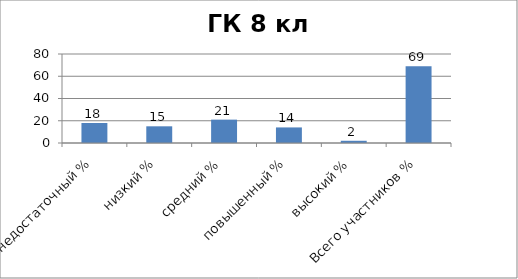
| Category | Series 0 |
|---|---|
| недостаточный % | 18 |
| низкий % | 15 |
| средний % | 21 |
| повышенный % | 14 |
| высокий % | 2 |
| Всего участников % | 69 |